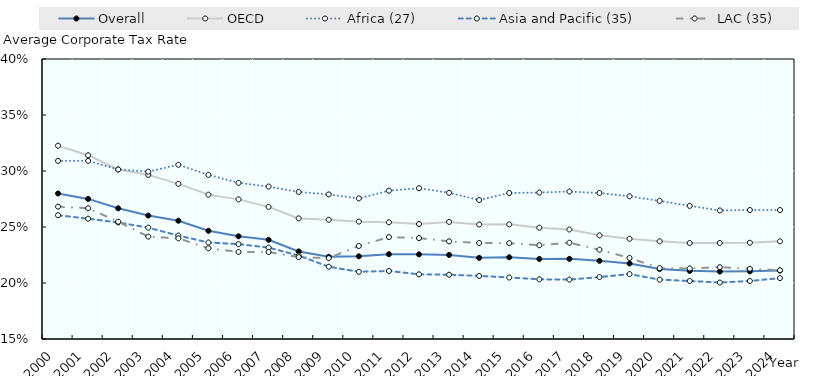
| Category | Overall | OECD | Africa (27) | Asia and Pacific (35) | LAC (35) |
|---|---|---|---|---|---|
| 2000.0 | 0.28 | 0.323 | 0.309 | 0.261 | 0.268 |
| 2001.0 | 0.275 | 0.314 | 0.309 | 0.257 | 0.267 |
| 2002.0 | 0.267 | 0.301 | 0.301 | 0.254 | 0.255 |
| 2003.0 | 0.26 | 0.297 | 0.299 | 0.249 | 0.241 |
| 2004.0 | 0.256 | 0.289 | 0.306 | 0.242 | 0.24 |
| 2005.0 | 0.247 | 0.279 | 0.297 | 0.236 | 0.231 |
| 2006.0 | 0.242 | 0.275 | 0.289 | 0.235 | 0.228 |
| 2007.0 | 0.239 | 0.268 | 0.286 | 0.232 | 0.228 |
| 2008.0 | 0.228 | 0.258 | 0.281 | 0.224 | 0.223 |
| 2009.0 | 0.223 | 0.256 | 0.279 | 0.215 | 0.222 |
| 2010.0 | 0.224 | 0.255 | 0.276 | 0.21 | 0.233 |
| 2011.0 | 0.226 | 0.254 | 0.282 | 0.211 | 0.241 |
| 2012.0 | 0.226 | 0.253 | 0.285 | 0.208 | 0.24 |
| 2013.0 | 0.225 | 0.255 | 0.281 | 0.207 | 0.237 |
| 2014.0 | 0.222 | 0.252 | 0.274 | 0.206 | 0.236 |
| 2015.0 | 0.223 | 0.252 | 0.28 | 0.205 | 0.236 |
| 2016.0 | 0.221 | 0.249 | 0.281 | 0.203 | 0.234 |
| 2017.0 | 0.222 | 0.248 | 0.282 | 0.203 | 0.236 |
| 2018.0 | 0.22 | 0.243 | 0.28 | 0.205 | 0.23 |
| 2019.0 | 0.217 | 0.239 | 0.277 | 0.208 | 0.222 |
| 2020.0 | 0.212 | 0.237 | 0.273 | 0.203 | 0.213 |
| 2021.0 | 0.211 | 0.236 | 0.269 | 0.202 | 0.213 |
| 2022.0 | 0.21 | 0.236 | 0.265 | 0.2 | 0.214 |
| 2023.0 | 0.21 | 0.236 | 0.265 | 0.202 | 0.213 |
| 2024.0 | 0.211 | 0.237 | 0.265 | 0.204 | 0.211 |